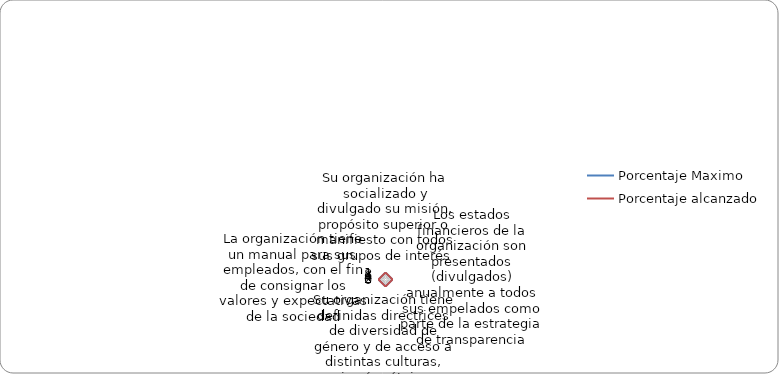
| Category | Porcentaje Maximo | Porcentaje alcanzado |
|---|---|---|
| Su organización ha socializado y divulgado su misión, propósito superior o manifiesto con todos sus grupos de interés  | 1 | 1 |
| Los estados financieros de la organización son presentados (divulgados) anualmente a todos sus empelados como parte de la estrategia de transparencia | 1 | 1 |
| Su organización tiene definidas directrices de diversidad de género y de acceso a distintas culturas, minorías étnicas, creencias religiosas diversas, con distintas orientaciones sexuales y capacidades físicas heterogéneas, para ocupar cargos directivos, j | 1 | 1 |
| La organización tiene un manual para sus empleados, con el fin de consignar los valores y expectativas de la sociedad | 1 | 1 |